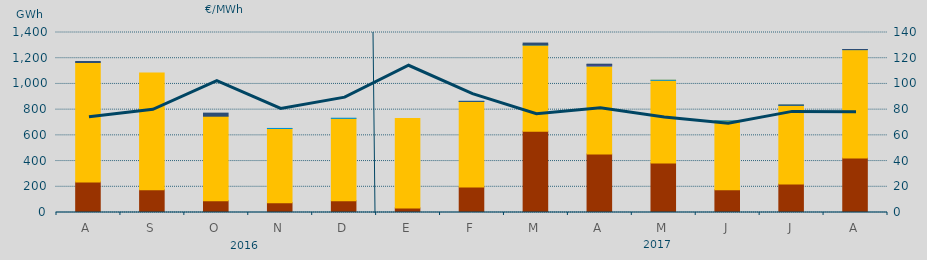
| Category | Carbón | Ciclo Combinado | Hidráulica | Nuclear | Consumo Bombeo |
|---|---|---|---|---|---|
| A | 238113.9 | 928531.9 | 0 | 0 | 7932.8 |
| S | 177358.6 | 907062.2 | 0 | 0 | 0 |
| O | 91594.1 | 657310.6 | 0 | 0 | 23959.3 |
| N | 76065.2 | 577468 | 240 | 0 | 0 |
| D | 91091.6 | 640964.5 | 1160 | 0 | 0 |
| E | 35729 | 696156.2 | 0 | 0 | 0 |
| F | 198516.2 | 665095.2 | 712.6 | 0 | 139.6 |
| M | 631868 | 670791.6 | 1411.7 | 0 | 13667.9 |
| A | 454829.4 | 684899.6 | 1412 | 9600 | 2812.1 |
| M | 384999.4 | 642959.4 | 538 | 0 | 0 |
| J | 176734.4 | 535700.2 | 240 | 0 | 0 |
| J | 221645.5 | 612390.3 | 245 | 0 | 1709.9 |
| A | 424631 | 842008.2 | 714.3 | 0 | 227.4 |